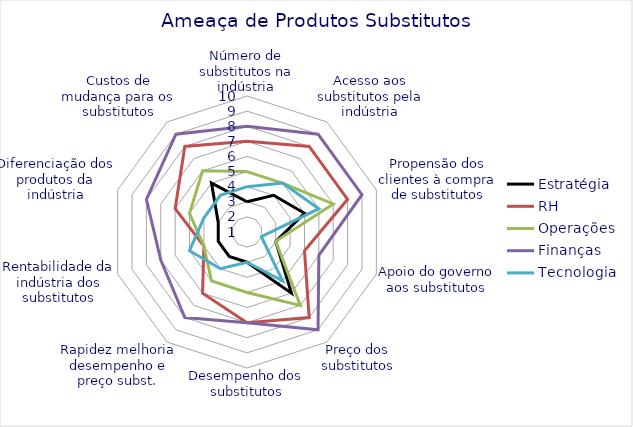
| Category | Estratégia | RH | Operações | Finanças | Tecnologia |
|---|---|---|---|---|---|
| Número de substitutos na indústria | 3 | 7 | 5 | 8 | 4 |
| Acesso aos substitutos pela indústria | 4 | 8 | 5 | 9 | 5 |
| Propensão dos clientes à compra de substitutos | 5 | 8 | 7 | 9 | 6 |
| Apoio do governo aos substitutos | 3 | 5 | 3 | 6 | 2 |
| Preço dos substitutos | 6 | 8 | 7 | 9 | 5 |
| Desempenho dos substitutos | 3 | 7 | 5 | 7 | 3 |
| Rapidez melhoria desempenho e preço subst. | 3 | 6 | 5 | 8 | 4 |
| Rentabilidade da indústria dos substitutos | 3 | 4 | 4 | 7 | 5 |
| Diferenciação dos produtos da indústria | 3 | 6 | 5 | 8 | 4 |
| Custos de mudança para os substitutos | 5 | 8 | 6 | 9 | 4 |